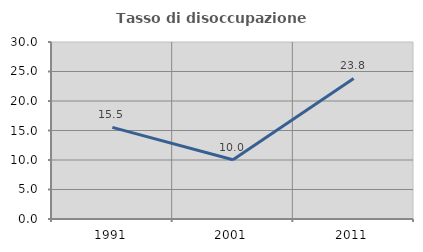
| Category | Tasso di disoccupazione giovanile  |
|---|---|
| 1991.0 | 15.525 |
| 2001.0 | 10.036 |
| 2011.0 | 23.832 |